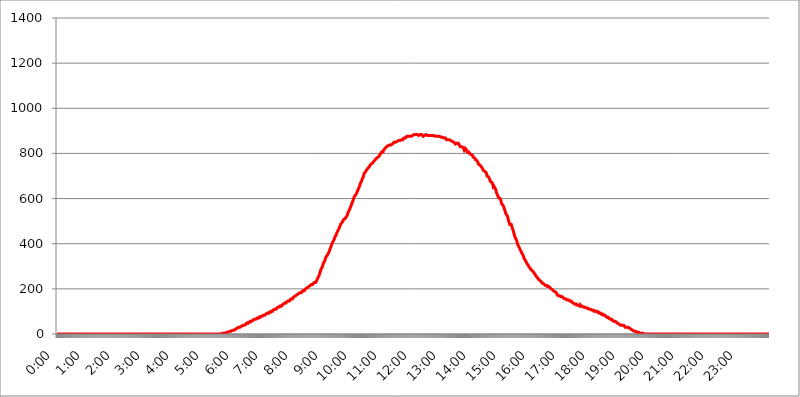
| Category | 2017.08.11. Intenzitás [W/m^2] |
|---|---|
| 0.0 | 0 |
| 0.0006944444444444445 | 0 |
| 0.001388888888888889 | 0 |
| 0.0020833333333333333 | 0 |
| 0.002777777777777778 | 0 |
| 0.003472222222222222 | 0 |
| 0.004166666666666667 | 0 |
| 0.004861111111111111 | 0 |
| 0.005555555555555556 | 0 |
| 0.0062499999999999995 | 0 |
| 0.006944444444444444 | 0 |
| 0.007638888888888889 | 0 |
| 0.008333333333333333 | 0 |
| 0.009027777777777779 | 0 |
| 0.009722222222222222 | 0 |
| 0.010416666666666666 | 0 |
| 0.011111111111111112 | 0 |
| 0.011805555555555555 | 0 |
| 0.012499999999999999 | 0 |
| 0.013194444444444444 | 0 |
| 0.013888888888888888 | 0 |
| 0.014583333333333332 | 0 |
| 0.015277777777777777 | 0 |
| 0.015972222222222224 | 0 |
| 0.016666666666666666 | 0 |
| 0.017361111111111112 | 0 |
| 0.018055555555555557 | 0 |
| 0.01875 | 0 |
| 0.019444444444444445 | 0 |
| 0.02013888888888889 | 0 |
| 0.020833333333333332 | 0 |
| 0.02152777777777778 | 0 |
| 0.022222222222222223 | 0 |
| 0.02291666666666667 | 0 |
| 0.02361111111111111 | 0 |
| 0.024305555555555556 | 0 |
| 0.024999999999999998 | 0 |
| 0.025694444444444447 | 0 |
| 0.02638888888888889 | 0 |
| 0.027083333333333334 | 0 |
| 0.027777777777777776 | 0 |
| 0.02847222222222222 | 0 |
| 0.029166666666666664 | 0 |
| 0.029861111111111113 | 0 |
| 0.030555555555555555 | 0 |
| 0.03125 | 0 |
| 0.03194444444444445 | 0 |
| 0.03263888888888889 | 0 |
| 0.03333333333333333 | 0 |
| 0.034027777777777775 | 0 |
| 0.034722222222222224 | 0 |
| 0.035416666666666666 | 0 |
| 0.036111111111111115 | 0 |
| 0.03680555555555556 | 0 |
| 0.0375 | 0 |
| 0.03819444444444444 | 0 |
| 0.03888888888888889 | 0 |
| 0.03958333333333333 | 0 |
| 0.04027777777777778 | 0 |
| 0.04097222222222222 | 0 |
| 0.041666666666666664 | 0 |
| 0.042361111111111106 | 0 |
| 0.04305555555555556 | 0 |
| 0.043750000000000004 | 0 |
| 0.044444444444444446 | 0 |
| 0.04513888888888889 | 0 |
| 0.04583333333333334 | 0 |
| 0.04652777777777778 | 0 |
| 0.04722222222222222 | 0 |
| 0.04791666666666666 | 0 |
| 0.04861111111111111 | 0 |
| 0.049305555555555554 | 0 |
| 0.049999999999999996 | 0 |
| 0.05069444444444445 | 0 |
| 0.051388888888888894 | 0 |
| 0.052083333333333336 | 0 |
| 0.05277777777777778 | 0 |
| 0.05347222222222222 | 0 |
| 0.05416666666666667 | 0 |
| 0.05486111111111111 | 0 |
| 0.05555555555555555 | 0 |
| 0.05625 | 0 |
| 0.05694444444444444 | 0 |
| 0.057638888888888885 | 0 |
| 0.05833333333333333 | 0 |
| 0.05902777777777778 | 0 |
| 0.059722222222222225 | 0 |
| 0.06041666666666667 | 0 |
| 0.061111111111111116 | 0 |
| 0.06180555555555556 | 0 |
| 0.0625 | 0 |
| 0.06319444444444444 | 0 |
| 0.06388888888888888 | 0 |
| 0.06458333333333334 | 0 |
| 0.06527777777777778 | 0 |
| 0.06597222222222222 | 0 |
| 0.06666666666666667 | 0 |
| 0.06736111111111111 | 0 |
| 0.06805555555555555 | 0 |
| 0.06874999999999999 | 0 |
| 0.06944444444444443 | 0 |
| 0.07013888888888889 | 0 |
| 0.07083333333333333 | 0 |
| 0.07152777777777779 | 0 |
| 0.07222222222222223 | 0 |
| 0.07291666666666667 | 0 |
| 0.07361111111111111 | 0 |
| 0.07430555555555556 | 0 |
| 0.075 | 0 |
| 0.07569444444444444 | 0 |
| 0.0763888888888889 | 0 |
| 0.07708333333333334 | 0 |
| 0.07777777777777778 | 0 |
| 0.07847222222222222 | 0 |
| 0.07916666666666666 | 0 |
| 0.0798611111111111 | 0 |
| 0.08055555555555556 | 0 |
| 0.08125 | 0 |
| 0.08194444444444444 | 0 |
| 0.08263888888888889 | 0 |
| 0.08333333333333333 | 0 |
| 0.08402777777777777 | 0 |
| 0.08472222222222221 | 0 |
| 0.08541666666666665 | 0 |
| 0.08611111111111112 | 0 |
| 0.08680555555555557 | 0 |
| 0.08750000000000001 | 0 |
| 0.08819444444444445 | 0 |
| 0.08888888888888889 | 0 |
| 0.08958333333333333 | 0 |
| 0.09027777777777778 | 0 |
| 0.09097222222222222 | 0 |
| 0.09166666666666667 | 0 |
| 0.09236111111111112 | 0 |
| 0.09305555555555556 | 0 |
| 0.09375 | 0 |
| 0.09444444444444444 | 0 |
| 0.09513888888888888 | 0 |
| 0.09583333333333333 | 0 |
| 0.09652777777777777 | 0 |
| 0.09722222222222222 | 0 |
| 0.09791666666666667 | 0 |
| 0.09861111111111111 | 0 |
| 0.09930555555555555 | 0 |
| 0.09999999999999999 | 0 |
| 0.10069444444444443 | 0 |
| 0.1013888888888889 | 0 |
| 0.10208333333333335 | 0 |
| 0.10277777777777779 | 0 |
| 0.10347222222222223 | 0 |
| 0.10416666666666667 | 0 |
| 0.10486111111111111 | 0 |
| 0.10555555555555556 | 0 |
| 0.10625 | 0 |
| 0.10694444444444444 | 0 |
| 0.1076388888888889 | 0 |
| 0.10833333333333334 | 0 |
| 0.10902777777777778 | 0 |
| 0.10972222222222222 | 0 |
| 0.1111111111111111 | 0 |
| 0.11180555555555556 | 0 |
| 0.11180555555555556 | 0 |
| 0.1125 | 0 |
| 0.11319444444444444 | 0 |
| 0.11388888888888889 | 0 |
| 0.11458333333333333 | 0 |
| 0.11527777777777777 | 0 |
| 0.11597222222222221 | 0 |
| 0.11666666666666665 | 0 |
| 0.1173611111111111 | 0 |
| 0.11805555555555557 | 0 |
| 0.11944444444444445 | 0 |
| 0.12013888888888889 | 0 |
| 0.12083333333333333 | 0 |
| 0.12152777777777778 | 0 |
| 0.12222222222222223 | 0 |
| 0.12291666666666667 | 0 |
| 0.12291666666666667 | 0 |
| 0.12361111111111112 | 0 |
| 0.12430555555555556 | 0 |
| 0.125 | 0 |
| 0.12569444444444444 | 0 |
| 0.12638888888888888 | 0 |
| 0.12708333333333333 | 0 |
| 0.16875 | 0 |
| 0.12847222222222224 | 0 |
| 0.12916666666666668 | 0 |
| 0.12986111111111112 | 0 |
| 0.13055555555555556 | 0 |
| 0.13125 | 0 |
| 0.13194444444444445 | 0 |
| 0.1326388888888889 | 0 |
| 0.13333333333333333 | 0 |
| 0.13402777777777777 | 0 |
| 0.13402777777777777 | 0 |
| 0.13472222222222222 | 0 |
| 0.13541666666666666 | 0 |
| 0.1361111111111111 | 0 |
| 0.13749999999999998 | 0 |
| 0.13819444444444443 | 0 |
| 0.1388888888888889 | 0 |
| 0.13958333333333334 | 0 |
| 0.14027777777777778 | 0 |
| 0.14097222222222222 | 0 |
| 0.14166666666666666 | 0 |
| 0.1423611111111111 | 0 |
| 0.14305555555555557 | 0 |
| 0.14375000000000002 | 0 |
| 0.14444444444444446 | 0 |
| 0.1451388888888889 | 0 |
| 0.1451388888888889 | 0 |
| 0.14652777777777778 | 0 |
| 0.14722222222222223 | 0 |
| 0.14791666666666667 | 0 |
| 0.1486111111111111 | 0 |
| 0.14930555555555555 | 0 |
| 0.15 | 0 |
| 0.15069444444444444 | 0 |
| 0.15138888888888888 | 0 |
| 0.15208333333333332 | 0 |
| 0.15277777777777776 | 0 |
| 0.15347222222222223 | 0 |
| 0.15416666666666667 | 0 |
| 0.15486111111111112 | 0 |
| 0.15555555555555556 | 0 |
| 0.15625 | 0 |
| 0.15694444444444444 | 0 |
| 0.15763888888888888 | 0 |
| 0.15833333333333333 | 0 |
| 0.15902777777777777 | 0 |
| 0.15972222222222224 | 0 |
| 0.16041666666666668 | 0 |
| 0.16111111111111112 | 0 |
| 0.16180555555555556 | 0 |
| 0.1625 | 0 |
| 0.16319444444444445 | 0 |
| 0.1638888888888889 | 0 |
| 0.16458333333333333 | 0 |
| 0.16527777777777777 | 0 |
| 0.16597222222222222 | 0 |
| 0.16666666666666666 | 0 |
| 0.1673611111111111 | 0 |
| 0.16805555555555554 | 0 |
| 0.16874999999999998 | 0 |
| 0.16944444444444443 | 0 |
| 0.17013888888888887 | 0 |
| 0.1708333333333333 | 0 |
| 0.17152777777777775 | 0 |
| 0.17222222222222225 | 0 |
| 0.1729166666666667 | 0 |
| 0.17361111111111113 | 0 |
| 0.17430555555555557 | 0 |
| 0.17500000000000002 | 0 |
| 0.17569444444444446 | 0 |
| 0.1763888888888889 | 0 |
| 0.17708333333333334 | 0 |
| 0.17777777777777778 | 0 |
| 0.17847222222222223 | 0 |
| 0.17916666666666667 | 0 |
| 0.1798611111111111 | 0 |
| 0.18055555555555555 | 0 |
| 0.18125 | 0 |
| 0.18194444444444444 | 0 |
| 0.1826388888888889 | 0 |
| 0.18333333333333335 | 0 |
| 0.1840277777777778 | 0 |
| 0.18472222222222223 | 0 |
| 0.18541666666666667 | 0 |
| 0.18611111111111112 | 0 |
| 0.18680555555555556 | 0 |
| 0.1875 | 0 |
| 0.18819444444444444 | 0 |
| 0.18888888888888888 | 0 |
| 0.18958333333333333 | 0 |
| 0.19027777777777777 | 0 |
| 0.1909722222222222 | 0 |
| 0.19166666666666665 | 0 |
| 0.19236111111111112 | 0 |
| 0.19305555555555554 | 0 |
| 0.19375 | 0 |
| 0.19444444444444445 | 0 |
| 0.1951388888888889 | 0 |
| 0.19583333333333333 | 0 |
| 0.19652777777777777 | 0 |
| 0.19722222222222222 | 0 |
| 0.19791666666666666 | 0 |
| 0.1986111111111111 | 0 |
| 0.19930555555555554 | 0 |
| 0.19999999999999998 | 0 |
| 0.20069444444444443 | 0 |
| 0.20138888888888887 | 0 |
| 0.2020833333333333 | 0 |
| 0.2027777777777778 | 0 |
| 0.2034722222222222 | 0 |
| 0.2041666666666667 | 0 |
| 0.20486111111111113 | 0 |
| 0.20555555555555557 | 0 |
| 0.20625000000000002 | 0 |
| 0.20694444444444446 | 0 |
| 0.2076388888888889 | 0 |
| 0.20833333333333334 | 0 |
| 0.20902777777777778 | 0 |
| 0.20972222222222223 | 0 |
| 0.21041666666666667 | 0 |
| 0.2111111111111111 | 0 |
| 0.21180555555555555 | 0 |
| 0.2125 | 0 |
| 0.21319444444444444 | 0 |
| 0.2138888888888889 | 0 |
| 0.21458333333333335 | 0 |
| 0.2152777777777778 | 0 |
| 0.21597222222222223 | 0 |
| 0.21666666666666667 | 0 |
| 0.21736111111111112 | 0 |
| 0.21805555555555556 | 0 |
| 0.21875 | 0 |
| 0.21944444444444444 | 0 |
| 0.22013888888888888 | 0 |
| 0.22083333333333333 | 0 |
| 0.22152777777777777 | 0 |
| 0.2222222222222222 | 0 |
| 0.22291666666666665 | 0 |
| 0.2236111111111111 | 0 |
| 0.22430555555555556 | 0 |
| 0.225 | 0 |
| 0.22569444444444445 | 0 |
| 0.2263888888888889 | 0 |
| 0.22708333333333333 | 0 |
| 0.22777777777777777 | 0 |
| 0.22847222222222222 | 0 |
| 0.22916666666666666 | 0 |
| 0.2298611111111111 | 0 |
| 0.23055555555555554 | 0 |
| 0.23124999999999998 | 3.525 |
| 0.23194444444444443 | 3.525 |
| 0.23263888888888887 | 3.525 |
| 0.2333333333333333 | 3.525 |
| 0.2340277777777778 | 3.525 |
| 0.2347222222222222 | 3.525 |
| 0.2354166666666667 | 3.525 |
| 0.23611111111111113 | 3.525 |
| 0.23680555555555557 | 3.525 |
| 0.23750000000000002 | 7.887 |
| 0.23819444444444446 | 7.887 |
| 0.2388888888888889 | 7.887 |
| 0.23958333333333334 | 7.887 |
| 0.24027777777777778 | 7.887 |
| 0.24097222222222223 | 7.887 |
| 0.24166666666666667 | 12.257 |
| 0.2423611111111111 | 12.257 |
| 0.24305555555555555 | 12.257 |
| 0.24375 | 12.257 |
| 0.24444444444444446 | 12.257 |
| 0.24513888888888888 | 12.257 |
| 0.24583333333333335 | 16.636 |
| 0.2465277777777778 | 16.636 |
| 0.24722222222222223 | 16.636 |
| 0.24791666666666667 | 16.636 |
| 0.24861111111111112 | 21.024 |
| 0.24930555555555556 | 21.024 |
| 0.25 | 21.024 |
| 0.25069444444444444 | 21.024 |
| 0.2513888888888889 | 21.024 |
| 0.2520833333333333 | 25.419 |
| 0.25277777777777777 | 25.419 |
| 0.2534722222222222 | 25.419 |
| 0.25416666666666665 | 29.823 |
| 0.2548611111111111 | 29.823 |
| 0.2555555555555556 | 29.823 |
| 0.25625000000000003 | 29.823 |
| 0.2569444444444445 | 34.234 |
| 0.2576388888888889 | 34.234 |
| 0.25833333333333336 | 34.234 |
| 0.2590277777777778 | 34.234 |
| 0.25972222222222224 | 38.653 |
| 0.2604166666666667 | 38.653 |
| 0.2611111111111111 | 38.653 |
| 0.26180555555555557 | 38.653 |
| 0.2625 | 38.653 |
| 0.26319444444444445 | 43.079 |
| 0.2638888888888889 | 43.079 |
| 0.26458333333333334 | 43.079 |
| 0.2652777777777778 | 47.511 |
| 0.2659722222222222 | 47.511 |
| 0.26666666666666666 | 47.511 |
| 0.2673611111111111 | 47.511 |
| 0.26805555555555555 | 51.951 |
| 0.26875 | 51.951 |
| 0.26944444444444443 | 51.951 |
| 0.2701388888888889 | 51.951 |
| 0.2708333333333333 | 56.398 |
| 0.27152777777777776 | 56.398 |
| 0.2722222222222222 | 56.398 |
| 0.27291666666666664 | 56.398 |
| 0.2736111111111111 | 56.398 |
| 0.2743055555555555 | 60.85 |
| 0.27499999999999997 | 60.85 |
| 0.27569444444444446 | 60.85 |
| 0.27638888888888885 | 65.31 |
| 0.27708333333333335 | 65.31 |
| 0.2777777777777778 | 65.31 |
| 0.27847222222222223 | 65.31 |
| 0.2791666666666667 | 65.31 |
| 0.2798611111111111 | 69.775 |
| 0.28055555555555556 | 69.775 |
| 0.28125 | 69.775 |
| 0.28194444444444444 | 69.775 |
| 0.2826388888888889 | 74.246 |
| 0.2833333333333333 | 74.246 |
| 0.28402777777777777 | 74.246 |
| 0.2847222222222222 | 74.246 |
| 0.28541666666666665 | 78.722 |
| 0.28611111111111115 | 78.722 |
| 0.28680555555555554 | 78.722 |
| 0.28750000000000003 | 78.722 |
| 0.2881944444444445 | 78.722 |
| 0.2888888888888889 | 83.205 |
| 0.28958333333333336 | 83.205 |
| 0.2902777777777778 | 83.205 |
| 0.29097222222222224 | 83.205 |
| 0.2916666666666667 | 83.205 |
| 0.2923611111111111 | 87.692 |
| 0.29305555555555557 | 87.692 |
| 0.29375 | 87.692 |
| 0.29444444444444445 | 92.184 |
| 0.2951388888888889 | 92.184 |
| 0.29583333333333334 | 92.184 |
| 0.2965277777777778 | 92.184 |
| 0.2972222222222222 | 96.682 |
| 0.29791666666666666 | 96.682 |
| 0.2986111111111111 | 96.682 |
| 0.29930555555555555 | 96.682 |
| 0.3 | 101.184 |
| 0.30069444444444443 | 101.184 |
| 0.3013888888888889 | 101.184 |
| 0.3020833333333333 | 101.184 |
| 0.30277777777777776 | 105.69 |
| 0.3034722222222222 | 105.69 |
| 0.30416666666666664 | 105.69 |
| 0.3048611111111111 | 110.201 |
| 0.3055555555555555 | 110.201 |
| 0.30624999999999997 | 110.201 |
| 0.3069444444444444 | 110.201 |
| 0.3076388888888889 | 114.716 |
| 0.30833333333333335 | 114.716 |
| 0.3090277777777778 | 114.716 |
| 0.30972222222222223 | 119.235 |
| 0.3104166666666667 | 119.235 |
| 0.3111111111111111 | 119.235 |
| 0.31180555555555556 | 119.235 |
| 0.3125 | 123.758 |
| 0.31319444444444444 | 123.758 |
| 0.3138888888888889 | 123.758 |
| 0.3145833333333333 | 123.758 |
| 0.31527777777777777 | 128.284 |
| 0.3159722222222222 | 128.284 |
| 0.31666666666666665 | 128.284 |
| 0.31736111111111115 | 132.814 |
| 0.31805555555555554 | 132.814 |
| 0.31875000000000003 | 137.347 |
| 0.3194444444444445 | 137.347 |
| 0.3201388888888889 | 137.347 |
| 0.32083333333333336 | 137.347 |
| 0.3215277777777778 | 141.884 |
| 0.32222222222222224 | 141.884 |
| 0.3229166666666667 | 141.884 |
| 0.3236111111111111 | 146.423 |
| 0.32430555555555557 | 146.423 |
| 0.325 | 146.423 |
| 0.32569444444444445 | 146.423 |
| 0.3263888888888889 | 150.964 |
| 0.32708333333333334 | 150.964 |
| 0.3277777777777778 | 155.509 |
| 0.3284722222222222 | 155.509 |
| 0.32916666666666666 | 155.509 |
| 0.3298611111111111 | 155.509 |
| 0.33055555555555555 | 160.056 |
| 0.33125 | 160.056 |
| 0.33194444444444443 | 164.605 |
| 0.3326388888888889 | 164.605 |
| 0.3333333333333333 | 164.605 |
| 0.3340277777777778 | 169.156 |
| 0.3347222222222222 | 169.156 |
| 0.3354166666666667 | 169.156 |
| 0.3361111111111111 | 173.709 |
| 0.3368055555555556 | 173.709 |
| 0.33749999999999997 | 173.709 |
| 0.33819444444444446 | 178.264 |
| 0.33888888888888885 | 178.264 |
| 0.33958333333333335 | 178.264 |
| 0.34027777777777773 | 182.82 |
| 0.34097222222222223 | 182.82 |
| 0.3416666666666666 | 182.82 |
| 0.3423611111111111 | 182.82 |
| 0.3430555555555555 | 187.378 |
| 0.34375 | 187.378 |
| 0.3444444444444445 | 191.937 |
| 0.3451388888888889 | 191.937 |
| 0.3458333333333334 | 191.937 |
| 0.34652777777777777 | 191.937 |
| 0.34722222222222227 | 196.497 |
| 0.34791666666666665 | 196.497 |
| 0.34861111111111115 | 201.058 |
| 0.34930555555555554 | 201.058 |
| 0.35000000000000003 | 201.058 |
| 0.3506944444444444 | 205.62 |
| 0.3513888888888889 | 205.62 |
| 0.3520833333333333 | 205.62 |
| 0.3527777777777778 | 210.182 |
| 0.3534722222222222 | 210.182 |
| 0.3541666666666667 | 210.182 |
| 0.3548611111111111 | 214.746 |
| 0.35555555555555557 | 214.746 |
| 0.35625 | 219.309 |
| 0.35694444444444445 | 219.309 |
| 0.3576388888888889 | 219.309 |
| 0.35833333333333334 | 219.309 |
| 0.3590277777777778 | 223.873 |
| 0.3597222222222222 | 223.873 |
| 0.36041666666666666 | 228.436 |
| 0.3611111111111111 | 228.436 |
| 0.36180555555555555 | 228.436 |
| 0.3625 | 228.436 |
| 0.36319444444444443 | 233 |
| 0.3638888888888889 | 237.564 |
| 0.3645833333333333 | 242.127 |
| 0.3652777777777778 | 246.689 |
| 0.3659722222222222 | 251.251 |
| 0.3666666666666667 | 255.813 |
| 0.3673611111111111 | 260.373 |
| 0.3680555555555556 | 269.49 |
| 0.36874999999999997 | 274.047 |
| 0.36944444444444446 | 283.156 |
| 0.37013888888888885 | 287.709 |
| 0.37083333333333335 | 292.259 |
| 0.37152777777777773 | 296.808 |
| 0.37222222222222223 | 301.354 |
| 0.3729166666666666 | 310.44 |
| 0.3736111111111111 | 314.98 |
| 0.3743055555555555 | 319.517 |
| 0.375 | 324.052 |
| 0.3756944444444445 | 328.584 |
| 0.3763888888888889 | 337.639 |
| 0.3770833333333334 | 342.162 |
| 0.37777777777777777 | 342.162 |
| 0.37847222222222227 | 346.682 |
| 0.37916666666666665 | 351.198 |
| 0.37986111111111115 | 355.712 |
| 0.38055555555555554 | 360.221 |
| 0.38125000000000003 | 364.728 |
| 0.3819444444444444 | 369.23 |
| 0.3826388888888889 | 378.224 |
| 0.3833333333333333 | 382.715 |
| 0.3840277777777778 | 387.202 |
| 0.3847222222222222 | 396.164 |
| 0.3854166666666667 | 400.638 |
| 0.3861111111111111 | 405.108 |
| 0.38680555555555557 | 409.574 |
| 0.3875 | 414.035 |
| 0.38819444444444445 | 418.492 |
| 0.3888888888888889 | 422.943 |
| 0.38958333333333334 | 431.833 |
| 0.3902777777777778 | 431.833 |
| 0.3909722222222222 | 436.27 |
| 0.39166666666666666 | 445.129 |
| 0.3923611111111111 | 445.129 |
| 0.39305555555555555 | 453.968 |
| 0.39375 | 458.38 |
| 0.39444444444444443 | 462.786 |
| 0.3951388888888889 | 467.187 |
| 0.3958333333333333 | 471.582 |
| 0.3965277777777778 | 475.972 |
| 0.3972222222222222 | 484.735 |
| 0.3979166666666667 | 489.108 |
| 0.3986111111111111 | 489.108 |
| 0.3993055555555556 | 493.475 |
| 0.39999999999999997 | 493.475 |
| 0.40069444444444446 | 497.836 |
| 0.40138888888888885 | 506.542 |
| 0.40208333333333335 | 506.542 |
| 0.40277777777777773 | 510.885 |
| 0.40347222222222223 | 510.885 |
| 0.4041666666666666 | 515.223 |
| 0.4048611111111111 | 515.223 |
| 0.4055555555555555 | 519.555 |
| 0.40625 | 523.88 |
| 0.4069444444444445 | 528.2 |
| 0.4076388888888889 | 536.82 |
| 0.4083333333333334 | 541.121 |
| 0.40902777777777777 | 545.416 |
| 0.40972222222222227 | 549.704 |
| 0.41041666666666665 | 553.986 |
| 0.41111111111111115 | 562.53 |
| 0.41180555555555554 | 566.793 |
| 0.41250000000000003 | 571.049 |
| 0.4131944444444444 | 579.542 |
| 0.4138888888888889 | 583.779 |
| 0.4145833333333333 | 588.009 |
| 0.4152777777777778 | 596.45 |
| 0.4159722222222222 | 600.661 |
| 0.4166666666666667 | 609.062 |
| 0.4173611111111111 | 613.252 |
| 0.41805555555555557 | 613.252 |
| 0.41875 | 617.436 |
| 0.41944444444444445 | 621.613 |
| 0.4201388888888889 | 625.784 |
| 0.42083333333333334 | 629.948 |
| 0.4215277777777778 | 638.256 |
| 0.4222222222222222 | 642.4 |
| 0.42291666666666666 | 646.537 |
| 0.4236111111111111 | 650.667 |
| 0.42430555555555555 | 658.909 |
| 0.425 | 663.019 |
| 0.42569444444444443 | 671.22 |
| 0.4263888888888889 | 671.22 |
| 0.4270833333333333 | 679.395 |
| 0.4277777777777778 | 687.544 |
| 0.4284722222222222 | 691.608 |
| 0.4291666666666667 | 695.666 |
| 0.4298611111111111 | 703.762 |
| 0.4305555555555556 | 711.832 |
| 0.43124999999999997 | 711.832 |
| 0.43194444444444446 | 715.858 |
| 0.43263888888888885 | 719.877 |
| 0.43333333333333335 | 719.877 |
| 0.43402777777777773 | 727.896 |
| 0.43472222222222223 | 731.896 |
| 0.4354166666666666 | 731.896 |
| 0.4361111111111111 | 735.89 |
| 0.4368055555555555 | 739.877 |
| 0.4375 | 739.877 |
| 0.4381944444444445 | 743.859 |
| 0.4388888888888889 | 747.834 |
| 0.4395833333333334 | 751.803 |
| 0.44027777777777777 | 751.803 |
| 0.44097222222222227 | 751.803 |
| 0.44166666666666665 | 755.766 |
| 0.44236111111111115 | 759.723 |
| 0.44305555555555554 | 759.723 |
| 0.44375000000000003 | 763.674 |
| 0.4444444444444444 | 763.674 |
| 0.4451388888888889 | 767.62 |
| 0.4458333333333333 | 771.559 |
| 0.4465277777777778 | 775.492 |
| 0.4472222222222222 | 775.492 |
| 0.4479166666666667 | 779.42 |
| 0.4486111111111111 | 779.42 |
| 0.44930555555555557 | 779.42 |
| 0.45 | 783.342 |
| 0.45069444444444445 | 787.258 |
| 0.4513888888888889 | 787.258 |
| 0.45208333333333334 | 791.169 |
| 0.4527777777777778 | 795.074 |
| 0.4534722222222222 | 798.974 |
| 0.45416666666666666 | 798.974 |
| 0.4548611111111111 | 806.757 |
| 0.45555555555555555 | 802.868 |
| 0.45625 | 806.757 |
| 0.45694444444444443 | 806.757 |
| 0.4576388888888889 | 814.519 |
| 0.4583333333333333 | 814.519 |
| 0.4590277777777778 | 814.519 |
| 0.4597222222222222 | 822.26 |
| 0.4604166666666667 | 822.26 |
| 0.4611111111111111 | 822.26 |
| 0.4618055555555556 | 829.981 |
| 0.46249999999999997 | 829.981 |
| 0.46319444444444446 | 829.981 |
| 0.46388888888888885 | 833.834 |
| 0.46458333333333335 | 829.981 |
| 0.46527777777777773 | 833.834 |
| 0.46597222222222223 | 837.682 |
| 0.4666666666666666 | 837.682 |
| 0.4673611111111111 | 837.682 |
| 0.4680555555555555 | 837.682 |
| 0.46875 | 841.526 |
| 0.4694444444444445 | 841.526 |
| 0.4701388888888889 | 841.526 |
| 0.4708333333333334 | 845.365 |
| 0.47152777777777777 | 845.365 |
| 0.47222222222222227 | 849.199 |
| 0.47291666666666665 | 849.199 |
| 0.47361111111111115 | 849.199 |
| 0.47430555555555554 | 849.199 |
| 0.47500000000000003 | 853.029 |
| 0.4756944444444444 | 853.029 |
| 0.4763888888888889 | 853.029 |
| 0.4770833333333333 | 856.855 |
| 0.4777777777777778 | 856.855 |
| 0.4784722222222222 | 856.855 |
| 0.4791666666666667 | 856.855 |
| 0.4798611111111111 | 856.855 |
| 0.48055555555555557 | 856.855 |
| 0.48125 | 860.676 |
| 0.48194444444444445 | 860.676 |
| 0.4826388888888889 | 860.676 |
| 0.48333333333333334 | 860.676 |
| 0.4840277777777778 | 860.676 |
| 0.4847222222222222 | 860.676 |
| 0.48541666666666666 | 864.493 |
| 0.4861111111111111 | 868.305 |
| 0.48680555555555555 | 868.305 |
| 0.4875 | 868.305 |
| 0.48819444444444443 | 868.305 |
| 0.4888888888888889 | 868.305 |
| 0.4895833333333333 | 872.114 |
| 0.4902777777777778 | 875.918 |
| 0.4909722222222222 | 875.918 |
| 0.4916666666666667 | 875.918 |
| 0.4923611111111111 | 875.918 |
| 0.4930555555555556 | 875.918 |
| 0.49374999999999997 | 872.114 |
| 0.49444444444444446 | 875.918 |
| 0.49513888888888885 | 875.918 |
| 0.49583333333333335 | 875.918 |
| 0.49652777777777773 | 875.918 |
| 0.49722222222222223 | 875.918 |
| 0.4979166666666666 | 879.719 |
| 0.4986111111111111 | 879.719 |
| 0.4993055555555555 | 883.516 |
| 0.5 | 883.516 |
| 0.5006944444444444 | 883.516 |
| 0.5013888888888889 | 879.719 |
| 0.5020833333333333 | 883.516 |
| 0.5027777777777778 | 883.516 |
| 0.5034722222222222 | 879.719 |
| 0.5041666666666667 | 883.516 |
| 0.5048611111111111 | 883.516 |
| 0.5055555555555555 | 883.516 |
| 0.50625 | 879.719 |
| 0.5069444444444444 | 879.719 |
| 0.5076388888888889 | 883.516 |
| 0.5083333333333333 | 879.719 |
| 0.5090277777777777 | 883.516 |
| 0.5097222222222222 | 883.516 |
| 0.5104166666666666 | 883.516 |
| 0.5111111111111112 | 883.516 |
| 0.5118055555555555 | 883.516 |
| 0.5125000000000001 | 879.719 |
| 0.5131944444444444 | 875.918 |
| 0.513888888888889 | 875.918 |
| 0.5145833333333333 | 875.918 |
| 0.5152777777777778 | 879.719 |
| 0.5159722222222222 | 879.719 |
| 0.5166666666666667 | 879.719 |
| 0.517361111111111 | 883.516 |
| 0.5180555555555556 | 879.719 |
| 0.5187499999999999 | 879.719 |
| 0.5194444444444445 | 879.719 |
| 0.5201388888888888 | 875.918 |
| 0.5208333333333334 | 879.719 |
| 0.5215277777777778 | 879.719 |
| 0.5222222222222223 | 879.719 |
| 0.5229166666666667 | 879.719 |
| 0.5236111111111111 | 879.719 |
| 0.5243055555555556 | 883.516 |
| 0.525 | 883.516 |
| 0.5256944444444445 | 879.719 |
| 0.5263888888888889 | 875.918 |
| 0.5270833333333333 | 879.719 |
| 0.5277777777777778 | 879.719 |
| 0.5284722222222222 | 879.719 |
| 0.5291666666666667 | 875.918 |
| 0.5298611111111111 | 875.918 |
| 0.5305555555555556 | 875.918 |
| 0.53125 | 875.918 |
| 0.5319444444444444 | 875.918 |
| 0.5326388888888889 | 872.114 |
| 0.5333333333333333 | 872.114 |
| 0.5340277777777778 | 875.918 |
| 0.5347222222222222 | 875.918 |
| 0.5354166666666667 | 875.918 |
| 0.5361111111111111 | 875.918 |
| 0.5368055555555555 | 875.918 |
| 0.5375 | 872.114 |
| 0.5381944444444444 | 872.114 |
| 0.5388888888888889 | 872.114 |
| 0.5395833333333333 | 872.114 |
| 0.5402777777777777 | 872.114 |
| 0.5409722222222222 | 872.114 |
| 0.5416666666666666 | 872.114 |
| 0.5423611111111112 | 868.305 |
| 0.5430555555555555 | 868.305 |
| 0.5437500000000001 | 868.305 |
| 0.5444444444444444 | 868.305 |
| 0.545138888888889 | 864.493 |
| 0.5458333333333333 | 860.676 |
| 0.5465277777777778 | 860.676 |
| 0.5472222222222222 | 860.676 |
| 0.5479166666666667 | 860.676 |
| 0.548611111111111 | 864.493 |
| 0.5493055555555556 | 860.676 |
| 0.5499999999999999 | 860.676 |
| 0.5506944444444445 | 856.855 |
| 0.5513888888888888 | 856.855 |
| 0.5520833333333334 | 856.855 |
| 0.5527777777777778 | 856.855 |
| 0.5534722222222223 | 853.029 |
| 0.5541666666666667 | 853.029 |
| 0.5548611111111111 | 853.029 |
| 0.5555555555555556 | 853.029 |
| 0.55625 | 849.199 |
| 0.5569444444444445 | 845.365 |
| 0.5576388888888889 | 845.365 |
| 0.5583333333333333 | 841.526 |
| 0.5590277777777778 | 837.682 |
| 0.5597222222222222 | 845.365 |
| 0.5604166666666667 | 845.365 |
| 0.5611111111111111 | 845.365 |
| 0.5618055555555556 | 841.526 |
| 0.5625 | 845.365 |
| 0.5631944444444444 | 841.526 |
| 0.5638888888888889 | 837.682 |
| 0.5645833333333333 | 833.834 |
| 0.5652777777777778 | 829.981 |
| 0.5659722222222222 | 826.123 |
| 0.5666666666666667 | 829.981 |
| 0.5673611111111111 | 829.981 |
| 0.5680555555555555 | 826.123 |
| 0.56875 | 826.123 |
| 0.5694444444444444 | 826.123 |
| 0.5701388888888889 | 822.26 |
| 0.5708333333333333 | 814.519 |
| 0.5715277777777777 | 814.519 |
| 0.5722222222222222 | 822.26 |
| 0.5729166666666666 | 818.392 |
| 0.5736111111111112 | 818.392 |
| 0.5743055555555555 | 814.519 |
| 0.5750000000000001 | 806.757 |
| 0.5756944444444444 | 802.868 |
| 0.576388888888889 | 806.757 |
| 0.5770833333333333 | 806.757 |
| 0.5777777777777778 | 802.868 |
| 0.5784722222222222 | 798.974 |
| 0.5791666666666667 | 798.974 |
| 0.579861111111111 | 795.074 |
| 0.5805555555555556 | 795.074 |
| 0.5812499999999999 | 795.074 |
| 0.5819444444444445 | 791.169 |
| 0.5826388888888888 | 791.169 |
| 0.5833333333333334 | 783.342 |
| 0.5840277777777778 | 779.42 |
| 0.5847222222222223 | 779.42 |
| 0.5854166666666667 | 779.42 |
| 0.5861111111111111 | 775.492 |
| 0.5868055555555556 | 771.559 |
| 0.5875 | 775.492 |
| 0.5881944444444445 | 767.62 |
| 0.5888888888888889 | 767.62 |
| 0.5895833333333333 | 763.674 |
| 0.5902777777777778 | 763.674 |
| 0.5909722222222222 | 751.803 |
| 0.5916666666666667 | 747.834 |
| 0.5923611111111111 | 747.834 |
| 0.5930555555555556 | 747.834 |
| 0.59375 | 743.859 |
| 0.5944444444444444 | 743.859 |
| 0.5951388888888889 | 739.877 |
| 0.5958333333333333 | 739.877 |
| 0.5965277777777778 | 731.896 |
| 0.5972222222222222 | 727.896 |
| 0.5979166666666667 | 723.889 |
| 0.5986111111111111 | 723.889 |
| 0.5993055555555555 | 723.889 |
| 0.6 | 719.877 |
| 0.6006944444444444 | 719.877 |
| 0.6013888888888889 | 715.858 |
| 0.6020833333333333 | 711.832 |
| 0.6027777777777777 | 699.717 |
| 0.6034722222222222 | 695.666 |
| 0.6041666666666666 | 695.666 |
| 0.6048611111111112 | 695.666 |
| 0.6055555555555555 | 695.666 |
| 0.6062500000000001 | 687.544 |
| 0.6069444444444444 | 683.473 |
| 0.607638888888889 | 675.311 |
| 0.6083333333333333 | 675.311 |
| 0.6090277777777778 | 675.311 |
| 0.6097222222222222 | 671.22 |
| 0.6104166666666667 | 667.123 |
| 0.611111111111111 | 658.909 |
| 0.6118055555555556 | 658.909 |
| 0.6124999999999999 | 642.4 |
| 0.6131944444444445 | 650.667 |
| 0.6138888888888888 | 650.667 |
| 0.6145833333333334 | 646.537 |
| 0.6152777777777778 | 638.256 |
| 0.6159722222222223 | 625.784 |
| 0.6166666666666667 | 621.613 |
| 0.6173611111111111 | 617.436 |
| 0.6180555555555556 | 613.252 |
| 0.61875 | 604.864 |
| 0.6194444444444445 | 604.864 |
| 0.6201388888888889 | 600.661 |
| 0.6208333333333333 | 600.661 |
| 0.6215277777777778 | 596.45 |
| 0.6222222222222222 | 592.233 |
| 0.6229166666666667 | 579.542 |
| 0.6236111111111111 | 579.542 |
| 0.6243055555555556 | 575.299 |
| 0.625 | 571.049 |
| 0.6256944444444444 | 566.793 |
| 0.6263888888888889 | 562.53 |
| 0.6270833333333333 | 553.986 |
| 0.6277777777777778 | 549.704 |
| 0.6284722222222222 | 541.121 |
| 0.6291666666666667 | 532.513 |
| 0.6298611111111111 | 532.513 |
| 0.6305555555555555 | 536.82 |
| 0.63125 | 523.88 |
| 0.6319444444444444 | 515.223 |
| 0.6326388888888889 | 506.542 |
| 0.6333333333333333 | 497.836 |
| 0.6340277777777777 | 497.836 |
| 0.6347222222222222 | 484.735 |
| 0.6354166666666666 | 489.108 |
| 0.6361111111111112 | 489.108 |
| 0.6368055555555555 | 484.735 |
| 0.6375000000000001 | 475.972 |
| 0.6381944444444444 | 471.582 |
| 0.638888888888889 | 462.786 |
| 0.6395833333333333 | 458.38 |
| 0.6402777777777778 | 449.551 |
| 0.6409722222222222 | 440.702 |
| 0.6416666666666667 | 431.833 |
| 0.642361111111111 | 427.39 |
| 0.6430555555555556 | 422.943 |
| 0.6437499999999999 | 418.492 |
| 0.6444444444444445 | 414.035 |
| 0.6451388888888888 | 405.108 |
| 0.6458333333333334 | 396.164 |
| 0.6465277777777778 | 396.164 |
| 0.6472222222222223 | 387.202 |
| 0.6479166666666667 | 382.715 |
| 0.6486111111111111 | 378.224 |
| 0.6493055555555556 | 373.729 |
| 0.65 | 369.23 |
| 0.6506944444444445 | 364.728 |
| 0.6513888888888889 | 360.221 |
| 0.6520833333333333 | 355.712 |
| 0.6527777777777778 | 351.198 |
| 0.6534722222222222 | 346.682 |
| 0.6541666666666667 | 342.162 |
| 0.6548611111111111 | 333.113 |
| 0.6555555555555556 | 333.113 |
| 0.65625 | 328.584 |
| 0.6569444444444444 | 324.052 |
| 0.6576388888888889 | 319.517 |
| 0.6583333333333333 | 314.98 |
| 0.6590277777777778 | 310.44 |
| 0.6597222222222222 | 310.44 |
| 0.6604166666666667 | 305.898 |
| 0.6611111111111111 | 301.354 |
| 0.6618055555555555 | 296.808 |
| 0.6625 | 296.808 |
| 0.6631944444444444 | 292.259 |
| 0.6638888888888889 | 287.709 |
| 0.6645833333333333 | 287.709 |
| 0.6652777777777777 | 283.156 |
| 0.6659722222222222 | 283.156 |
| 0.6666666666666666 | 278.603 |
| 0.6673611111111111 | 278.603 |
| 0.6680555555555556 | 274.047 |
| 0.6687500000000001 | 269.49 |
| 0.6694444444444444 | 269.49 |
| 0.6701388888888888 | 264.932 |
| 0.6708333333333334 | 260.373 |
| 0.6715277777777778 | 255.813 |
| 0.6722222222222222 | 255.813 |
| 0.6729166666666666 | 251.251 |
| 0.6736111111111112 | 251.251 |
| 0.6743055555555556 | 246.689 |
| 0.6749999999999999 | 242.127 |
| 0.6756944444444444 | 242.127 |
| 0.6763888888888889 | 237.564 |
| 0.6770833333333334 | 237.564 |
| 0.6777777777777777 | 237.564 |
| 0.6784722222222223 | 233 |
| 0.6791666666666667 | 228.436 |
| 0.6798611111111111 | 228.436 |
| 0.6805555555555555 | 228.436 |
| 0.68125 | 223.873 |
| 0.6819444444444445 | 223.873 |
| 0.6826388888888889 | 223.873 |
| 0.6833333333333332 | 219.309 |
| 0.6840277777777778 | 219.309 |
| 0.6847222222222222 | 214.746 |
| 0.6854166666666667 | 214.746 |
| 0.686111111111111 | 214.746 |
| 0.6868055555555556 | 214.746 |
| 0.6875 | 210.182 |
| 0.6881944444444444 | 210.182 |
| 0.688888888888889 | 210.182 |
| 0.6895833333333333 | 210.182 |
| 0.6902777777777778 | 210.182 |
| 0.6909722222222222 | 205.62 |
| 0.6916666666666668 | 205.62 |
| 0.6923611111111111 | 201.058 |
| 0.6930555555555555 | 201.058 |
| 0.69375 | 201.058 |
| 0.6944444444444445 | 196.497 |
| 0.6951388888888889 | 196.497 |
| 0.6958333333333333 | 191.937 |
| 0.6965277777777777 | 191.937 |
| 0.6972222222222223 | 191.937 |
| 0.6979166666666666 | 187.378 |
| 0.6986111111111111 | 187.378 |
| 0.6993055555555556 | 187.378 |
| 0.7000000000000001 | 182.82 |
| 0.7006944444444444 | 178.264 |
| 0.7013888888888888 | 173.709 |
| 0.7020833333333334 | 173.709 |
| 0.7027777777777778 | 169.156 |
| 0.7034722222222222 | 169.156 |
| 0.7041666666666666 | 169.156 |
| 0.7048611111111112 | 169.156 |
| 0.7055555555555556 | 169.156 |
| 0.7062499999999999 | 164.605 |
| 0.7069444444444444 | 164.605 |
| 0.7076388888888889 | 164.605 |
| 0.7083333333333334 | 164.605 |
| 0.7090277777777777 | 164.605 |
| 0.7097222222222223 | 160.056 |
| 0.7104166666666667 | 160.056 |
| 0.7111111111111111 | 160.056 |
| 0.7118055555555555 | 155.509 |
| 0.7125 | 155.509 |
| 0.7131944444444445 | 155.509 |
| 0.7138888888888889 | 155.509 |
| 0.7145833333333332 | 155.509 |
| 0.7152777777777778 | 150.964 |
| 0.7159722222222222 | 150.964 |
| 0.7166666666666667 | 150.964 |
| 0.717361111111111 | 150.964 |
| 0.7180555555555556 | 150.964 |
| 0.71875 | 146.423 |
| 0.7194444444444444 | 146.423 |
| 0.720138888888889 | 146.423 |
| 0.7208333333333333 | 146.423 |
| 0.7215277777777778 | 141.884 |
| 0.7222222222222222 | 141.884 |
| 0.7229166666666668 | 141.884 |
| 0.7236111111111111 | 137.347 |
| 0.7243055555555555 | 137.347 |
| 0.725 | 137.347 |
| 0.7256944444444445 | 132.814 |
| 0.7263888888888889 | 132.814 |
| 0.7270833333333333 | 132.814 |
| 0.7277777777777777 | 132.814 |
| 0.7284722222222223 | 128.284 |
| 0.7291666666666666 | 128.284 |
| 0.7298611111111111 | 128.284 |
| 0.7305555555555556 | 128.284 |
| 0.7312500000000001 | 128.284 |
| 0.7319444444444444 | 128.284 |
| 0.7326388888888888 | 123.758 |
| 0.7333333333333334 | 128.284 |
| 0.7340277777777778 | 123.758 |
| 0.7347222222222222 | 123.758 |
| 0.7354166666666666 | 123.758 |
| 0.7361111111111112 | 123.758 |
| 0.7368055555555556 | 123.758 |
| 0.7374999999999999 | 119.235 |
| 0.7381944444444444 | 119.235 |
| 0.7388888888888889 | 119.235 |
| 0.7395833333333334 | 119.235 |
| 0.7402777777777777 | 119.235 |
| 0.7409722222222223 | 119.235 |
| 0.7416666666666667 | 114.716 |
| 0.7423611111111111 | 114.716 |
| 0.7430555555555555 | 114.716 |
| 0.74375 | 114.716 |
| 0.7444444444444445 | 114.716 |
| 0.7451388888888889 | 114.716 |
| 0.7458333333333332 | 110.201 |
| 0.7465277777777778 | 110.201 |
| 0.7472222222222222 | 110.201 |
| 0.7479166666666667 | 110.201 |
| 0.748611111111111 | 110.201 |
| 0.7493055555555556 | 110.201 |
| 0.75 | 105.69 |
| 0.7506944444444444 | 105.69 |
| 0.751388888888889 | 105.69 |
| 0.7520833333333333 | 105.69 |
| 0.7527777777777778 | 101.184 |
| 0.7534722222222222 | 101.184 |
| 0.7541666666666668 | 101.184 |
| 0.7548611111111111 | 101.184 |
| 0.7555555555555555 | 101.184 |
| 0.75625 | 101.184 |
| 0.7569444444444445 | 101.184 |
| 0.7576388888888889 | 96.682 |
| 0.7583333333333333 | 96.682 |
| 0.7590277777777777 | 96.682 |
| 0.7597222222222223 | 96.682 |
| 0.7604166666666666 | 92.184 |
| 0.7611111111111111 | 92.184 |
| 0.7618055555555556 | 92.184 |
| 0.7625000000000001 | 92.184 |
| 0.7631944444444444 | 87.692 |
| 0.7638888888888888 | 87.692 |
| 0.7645833333333334 | 87.692 |
| 0.7652777777777778 | 87.692 |
| 0.7659722222222222 | 83.205 |
| 0.7666666666666666 | 83.205 |
| 0.7673611111111112 | 83.205 |
| 0.7680555555555556 | 83.205 |
| 0.7687499999999999 | 83.205 |
| 0.7694444444444444 | 78.722 |
| 0.7701388888888889 | 78.722 |
| 0.7708333333333334 | 74.246 |
| 0.7715277777777777 | 74.246 |
| 0.7722222222222223 | 74.246 |
| 0.7729166666666667 | 74.246 |
| 0.7736111111111111 | 69.775 |
| 0.7743055555555555 | 69.775 |
| 0.775 | 69.775 |
| 0.7756944444444445 | 65.31 |
| 0.7763888888888889 | 65.31 |
| 0.7770833333333332 | 65.31 |
| 0.7777777777777778 | 65.31 |
| 0.7784722222222222 | 60.85 |
| 0.7791666666666667 | 60.85 |
| 0.779861111111111 | 60.85 |
| 0.7805555555555556 | 56.398 |
| 0.78125 | 56.398 |
| 0.7819444444444444 | 56.398 |
| 0.782638888888889 | 56.398 |
| 0.7833333333333333 | 56.398 |
| 0.7840277777777778 | 51.951 |
| 0.7847222222222222 | 51.951 |
| 0.7854166666666668 | 51.951 |
| 0.7861111111111111 | 47.511 |
| 0.7868055555555555 | 47.511 |
| 0.7875 | 47.511 |
| 0.7881944444444445 | 43.079 |
| 0.7888888888888889 | 38.653 |
| 0.7895833333333333 | 38.653 |
| 0.7902777777777777 | 38.653 |
| 0.7909722222222223 | 38.653 |
| 0.7916666666666666 | 38.653 |
| 0.7923611111111111 | 38.653 |
| 0.7930555555555556 | 38.653 |
| 0.7937500000000001 | 38.653 |
| 0.7944444444444444 | 38.653 |
| 0.7951388888888888 | 34.234 |
| 0.7958333333333334 | 34.234 |
| 0.7965277777777778 | 29.823 |
| 0.7972222222222222 | 29.823 |
| 0.7979166666666666 | 29.823 |
| 0.7986111111111112 | 29.823 |
| 0.7993055555555556 | 29.823 |
| 0.7999999999999999 | 29.823 |
| 0.8006944444444444 | 29.823 |
| 0.8013888888888889 | 29.823 |
| 0.8020833333333334 | 25.419 |
| 0.8027777777777777 | 25.419 |
| 0.8034722222222223 | 21.024 |
| 0.8041666666666667 | 21.024 |
| 0.8048611111111111 | 21.024 |
| 0.8055555555555555 | 21.024 |
| 0.80625 | 21.024 |
| 0.8069444444444445 | 16.636 |
| 0.8076388888888889 | 16.636 |
| 0.8083333333333332 | 16.636 |
| 0.8090277777777778 | 12.257 |
| 0.8097222222222222 | 12.257 |
| 0.8104166666666667 | 12.257 |
| 0.811111111111111 | 12.257 |
| 0.8118055555555556 | 12.257 |
| 0.8125 | 7.887 |
| 0.8131944444444444 | 7.887 |
| 0.813888888888889 | 7.887 |
| 0.8145833333333333 | 7.887 |
| 0.8152777777777778 | 7.887 |
| 0.8159722222222222 | 3.525 |
| 0.8166666666666668 | 3.525 |
| 0.8173611111111111 | 3.525 |
| 0.8180555555555555 | 3.525 |
| 0.81875 | 3.525 |
| 0.8194444444444445 | 3.525 |
| 0.8201388888888889 | 3.525 |
| 0.8208333333333333 | 3.525 |
| 0.8215277777777777 | 3.525 |
| 0.8222222222222223 | 0 |
| 0.8229166666666666 | 0 |
| 0.8236111111111111 | 0 |
| 0.8243055555555556 | 0 |
| 0.8250000000000001 | 0 |
| 0.8256944444444444 | 0 |
| 0.8263888888888888 | 0 |
| 0.8270833333333334 | 0 |
| 0.8277777777777778 | 0 |
| 0.8284722222222222 | 0 |
| 0.8291666666666666 | 0 |
| 0.8298611111111112 | 0 |
| 0.8305555555555556 | 0 |
| 0.8312499999999999 | 0 |
| 0.8319444444444444 | 0 |
| 0.8326388888888889 | 0 |
| 0.8333333333333334 | 0 |
| 0.8340277777777777 | 0 |
| 0.8347222222222223 | 0 |
| 0.8354166666666667 | 0 |
| 0.8361111111111111 | 0 |
| 0.8368055555555555 | 0 |
| 0.8375 | 0 |
| 0.8381944444444445 | 0 |
| 0.8388888888888889 | 0 |
| 0.8395833333333332 | 0 |
| 0.8402777777777778 | 0 |
| 0.8409722222222222 | 0 |
| 0.8416666666666667 | 0 |
| 0.842361111111111 | 0 |
| 0.8430555555555556 | 0 |
| 0.84375 | 0 |
| 0.8444444444444444 | 0 |
| 0.845138888888889 | 0 |
| 0.8458333333333333 | 0 |
| 0.8465277777777778 | 0 |
| 0.8472222222222222 | 0 |
| 0.8479166666666668 | 0 |
| 0.8486111111111111 | 0 |
| 0.8493055555555555 | 0 |
| 0.85 | 0 |
| 0.8506944444444445 | 0 |
| 0.8513888888888889 | 0 |
| 0.8520833333333333 | 0 |
| 0.8527777777777777 | 0 |
| 0.8534722222222223 | 0 |
| 0.8541666666666666 | 0 |
| 0.8548611111111111 | 0 |
| 0.8555555555555556 | 0 |
| 0.8562500000000001 | 0 |
| 0.8569444444444444 | 0 |
| 0.8576388888888888 | 0 |
| 0.8583333333333334 | 0 |
| 0.8590277777777778 | 0 |
| 0.8597222222222222 | 0 |
| 0.8604166666666666 | 0 |
| 0.8611111111111112 | 0 |
| 0.8618055555555556 | 0 |
| 0.8624999999999999 | 0 |
| 0.8631944444444444 | 0 |
| 0.8638888888888889 | 0 |
| 0.8645833333333334 | 0 |
| 0.8652777777777777 | 0 |
| 0.8659722222222223 | 0 |
| 0.8666666666666667 | 0 |
| 0.8673611111111111 | 0 |
| 0.8680555555555555 | 0 |
| 0.86875 | 0 |
| 0.8694444444444445 | 0 |
| 0.8701388888888889 | 0 |
| 0.8708333333333332 | 0 |
| 0.8715277777777778 | 0 |
| 0.8722222222222222 | 0 |
| 0.8729166666666667 | 0 |
| 0.873611111111111 | 0 |
| 0.8743055555555556 | 0 |
| 0.875 | 0 |
| 0.8756944444444444 | 0 |
| 0.876388888888889 | 0 |
| 0.8770833333333333 | 0 |
| 0.8777777777777778 | 0 |
| 0.8784722222222222 | 0 |
| 0.8791666666666668 | 0 |
| 0.8798611111111111 | 0 |
| 0.8805555555555555 | 0 |
| 0.88125 | 0 |
| 0.8819444444444445 | 0 |
| 0.8826388888888889 | 0 |
| 0.8833333333333333 | 0 |
| 0.8840277777777777 | 0 |
| 0.8847222222222223 | 0 |
| 0.8854166666666666 | 0 |
| 0.8861111111111111 | 0 |
| 0.8868055555555556 | 0 |
| 0.8875000000000001 | 0 |
| 0.8881944444444444 | 0 |
| 0.8888888888888888 | 0 |
| 0.8895833333333334 | 0 |
| 0.8902777777777778 | 0 |
| 0.8909722222222222 | 0 |
| 0.8916666666666666 | 0 |
| 0.8923611111111112 | 0 |
| 0.8930555555555556 | 0 |
| 0.8937499999999999 | 0 |
| 0.8944444444444444 | 0 |
| 0.8951388888888889 | 0 |
| 0.8958333333333334 | 0 |
| 0.8965277777777777 | 0 |
| 0.8972222222222223 | 0 |
| 0.8979166666666667 | 0 |
| 0.8986111111111111 | 0 |
| 0.8993055555555555 | 0 |
| 0.9 | 0 |
| 0.9006944444444445 | 0 |
| 0.9013888888888889 | 0 |
| 0.9020833333333332 | 0 |
| 0.9027777777777778 | 0 |
| 0.9034722222222222 | 0 |
| 0.9041666666666667 | 0 |
| 0.904861111111111 | 0 |
| 0.9055555555555556 | 0 |
| 0.90625 | 0 |
| 0.9069444444444444 | 0 |
| 0.907638888888889 | 0 |
| 0.9083333333333333 | 0 |
| 0.9090277777777778 | 0 |
| 0.9097222222222222 | 0 |
| 0.9104166666666668 | 0 |
| 0.9111111111111111 | 0 |
| 0.9118055555555555 | 0 |
| 0.9125 | 0 |
| 0.9131944444444445 | 0 |
| 0.9138888888888889 | 0 |
| 0.9145833333333333 | 0 |
| 0.9152777777777777 | 0 |
| 0.9159722222222223 | 0 |
| 0.9166666666666666 | 0 |
| 0.9173611111111111 | 0 |
| 0.9180555555555556 | 0 |
| 0.9187500000000001 | 0 |
| 0.9194444444444444 | 0 |
| 0.9201388888888888 | 0 |
| 0.9208333333333334 | 0 |
| 0.9215277777777778 | 0 |
| 0.9222222222222222 | 0 |
| 0.9229166666666666 | 0 |
| 0.9236111111111112 | 0 |
| 0.9243055555555556 | 0 |
| 0.9249999999999999 | 0 |
| 0.9256944444444444 | 0 |
| 0.9263888888888889 | 0 |
| 0.9270833333333334 | 0 |
| 0.9277777777777777 | 0 |
| 0.9284722222222223 | 0 |
| 0.9291666666666667 | 0 |
| 0.9298611111111111 | 0 |
| 0.9305555555555555 | 0 |
| 0.93125 | 0 |
| 0.9319444444444445 | 0 |
| 0.9326388888888889 | 0 |
| 0.9333333333333332 | 0 |
| 0.9340277777777778 | 0 |
| 0.9347222222222222 | 0 |
| 0.9354166666666667 | 0 |
| 0.936111111111111 | 0 |
| 0.9368055555555556 | 0 |
| 0.9375 | 0 |
| 0.9381944444444444 | 0 |
| 0.938888888888889 | 0 |
| 0.9395833333333333 | 0 |
| 0.9402777777777778 | 0 |
| 0.9409722222222222 | 0 |
| 0.9416666666666668 | 0 |
| 0.9423611111111111 | 0 |
| 0.9430555555555555 | 0 |
| 0.94375 | 0 |
| 0.9444444444444445 | 0 |
| 0.9451388888888889 | 0 |
| 0.9458333333333333 | 0 |
| 0.9465277777777777 | 0 |
| 0.9472222222222223 | 0 |
| 0.9479166666666666 | 0 |
| 0.9486111111111111 | 0 |
| 0.9493055555555556 | 0 |
| 0.9500000000000001 | 0 |
| 0.9506944444444444 | 0 |
| 0.9513888888888888 | 0 |
| 0.9520833333333334 | 0 |
| 0.9527777777777778 | 0 |
| 0.9534722222222222 | 0 |
| 0.9541666666666666 | 0 |
| 0.9548611111111112 | 0 |
| 0.9555555555555556 | 0 |
| 0.9562499999999999 | 0 |
| 0.9569444444444444 | 0 |
| 0.9576388888888889 | 0 |
| 0.9583333333333334 | 0 |
| 0.9590277777777777 | 0 |
| 0.9597222222222223 | 0 |
| 0.9604166666666667 | 0 |
| 0.9611111111111111 | 0 |
| 0.9618055555555555 | 0 |
| 0.9625 | 0 |
| 0.9631944444444445 | 0 |
| 0.9638888888888889 | 0 |
| 0.9645833333333332 | 0 |
| 0.9652777777777778 | 0 |
| 0.9659722222222222 | 0 |
| 0.9666666666666667 | 0 |
| 0.967361111111111 | 0 |
| 0.9680555555555556 | 0 |
| 0.96875 | 0 |
| 0.9694444444444444 | 0 |
| 0.970138888888889 | 0 |
| 0.9708333333333333 | 0 |
| 0.9715277777777778 | 0 |
| 0.9722222222222222 | 0 |
| 0.9729166666666668 | 0 |
| 0.9736111111111111 | 0 |
| 0.9743055555555555 | 0 |
| 0.975 | 0 |
| 0.9756944444444445 | 0 |
| 0.9763888888888889 | 0 |
| 0.9770833333333333 | 0 |
| 0.9777777777777777 | 0 |
| 0.9784722222222223 | 0 |
| 0.9791666666666666 | 0 |
| 0.9798611111111111 | 0 |
| 0.9805555555555556 | 0 |
| 0.9812500000000001 | 0 |
| 0.9819444444444444 | 0 |
| 0.9826388888888888 | 0 |
| 0.9833333333333334 | 0 |
| 0.9840277777777778 | 0 |
| 0.9847222222222222 | 0 |
| 0.9854166666666666 | 0 |
| 0.9861111111111112 | 0 |
| 0.9868055555555556 | 0 |
| 0.9874999999999999 | 0 |
| 0.9881944444444444 | 0 |
| 0.9888888888888889 | 0 |
| 0.9895833333333334 | 0 |
| 0.9902777777777777 | 0 |
| 0.9909722222222223 | 0 |
| 0.9916666666666667 | 0 |
| 0.9923611111111111 | 0 |
| 0.9930555555555555 | 0 |
| 0.99375 | 0 |
| 0.9944444444444445 | 0 |
| 0.9951388888888889 | 0 |
| 0.9958333333333332 | 0 |
| 0.9965277777777778 | 0 |
| 0.9972222222222222 | 0 |
| 0.9979166666666667 | 0 |
| 0.998611111111111 | 0 |
| 0.9993055555555556 | 0 |